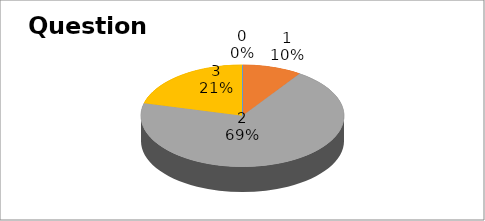
| Category | Series 0 |
|---|---|
| 0 | 0 |
| 1 | 9 |
| 2 | 66 |
| 3 | 20 |